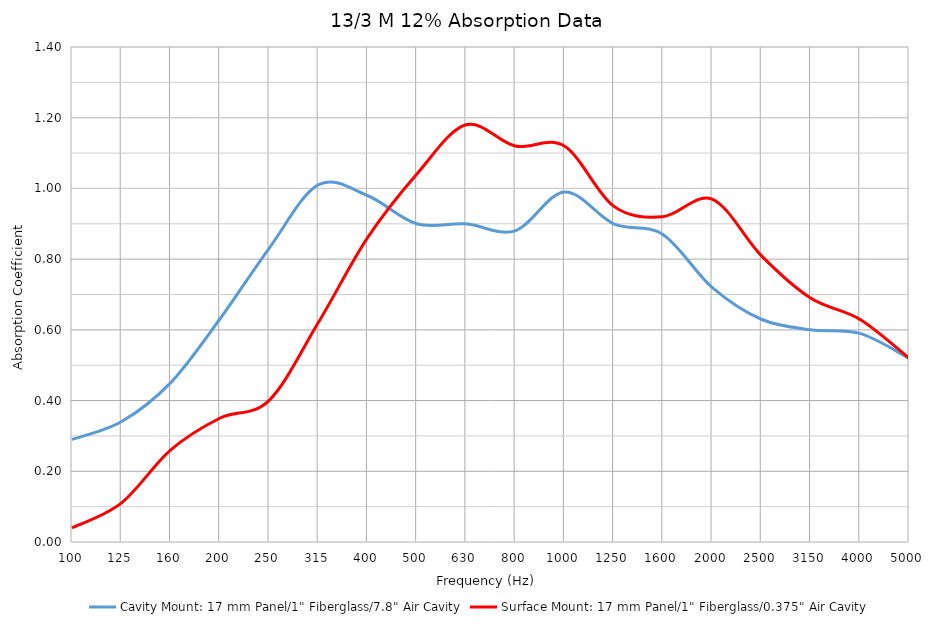
| Category | Cavity Mount: 17 mm Panel/1" Fiberglass/7.8" Air Cavity | Surface Mount: 17 mm Panel/1" Fiberglass/0.375" Air Cavity |
|---|---|---|
| 100.0 | 0.29 | 0.04 |
| 125.0 | 0.34 | 0.11 |
| 160.0 | 0.45 | 0.26 |
| 200.0 | 0.63 | 0.35 |
| 250.0 | 0.83 | 0.4 |
| 315.0 | 1.01 | 0.62 |
| 400.0 | 0.98 | 0.86 |
| 500.0 | 0.9 | 1.04 |
| 630.0 | 0.9 | 1.18 |
| 800.0 | 0.88 | 1.12 |
| 1000.0 | 0.99 | 1.12 |
| 1250.0 | 0.9 | 0.95 |
| 1600.0 | 0.87 | 0.92 |
| 2000.0 | 0.72 | 0.97 |
| 2500.0 | 0.63 | 0.81 |
| 3150.0 | 0.6 | 0.69 |
| 4000.0 | 0.59 | 0.63 |
| 5000.0 | 0.52 | 0.52 |